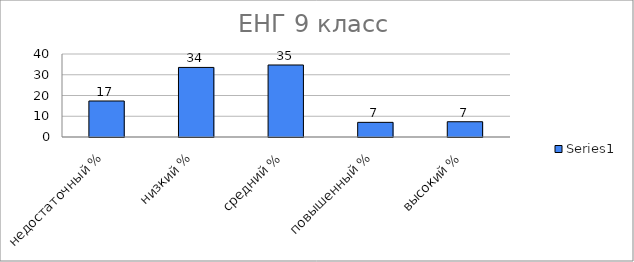
| Category | Series 0 |
|---|---|
| недостаточный % | 17.353 |
| низкий % | 33.529 |
| средний % | 34.706 |
| повышенный % | 7.059 |
| высокий % | 7.353 |